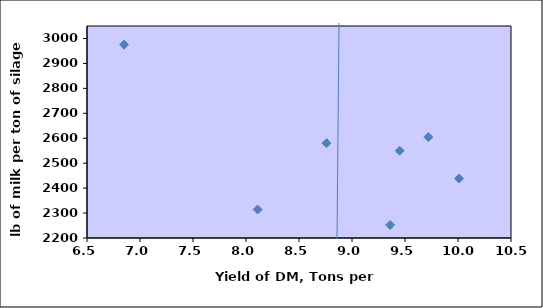
| Category | Series 0 |
|---|---|
| 8.76 | 2580.25 |
| 8.11 | 2314 |
| 10.01 | 2438.333 |
| 6.85 | 2975.25 |
| 9.45 | 2550 |
| 9.36 | 2252.25 |
| 9.72 | 2604.5 |